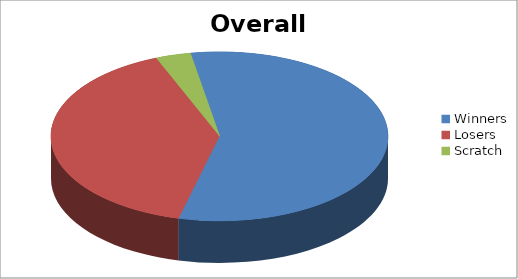
| Category | Series 1 |
|---|---|
| Winners | 17 |
| Losers | 12 |
| Scratch | 1 |